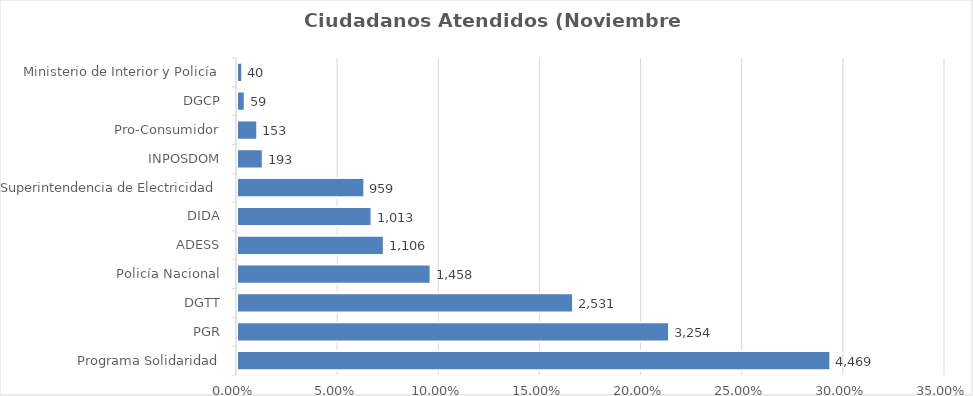
| Category | Porcentaje |
|---|---|
| Programa Solidaridad | 0.293 |
| PGR | 0.214 |
| DGTT | 0.166 |
| Policía Nacional | 0.096 |
| ADESS | 0.073 |
| DIDA | 0.066 |
| Superintendencia de Electricidad | 0.063 |
| INPOSDOM | 0.013 |
| Pro-Consumidor | 0.01 |
| DGCP | 0.004 |
| Ministerio de Interior y Policía | 0.003 |